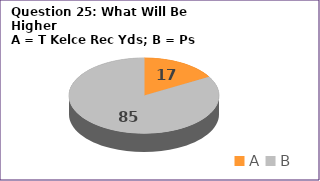
| Category | Series 0 |
|---|---|
| A | 17 |
| B | 85 |